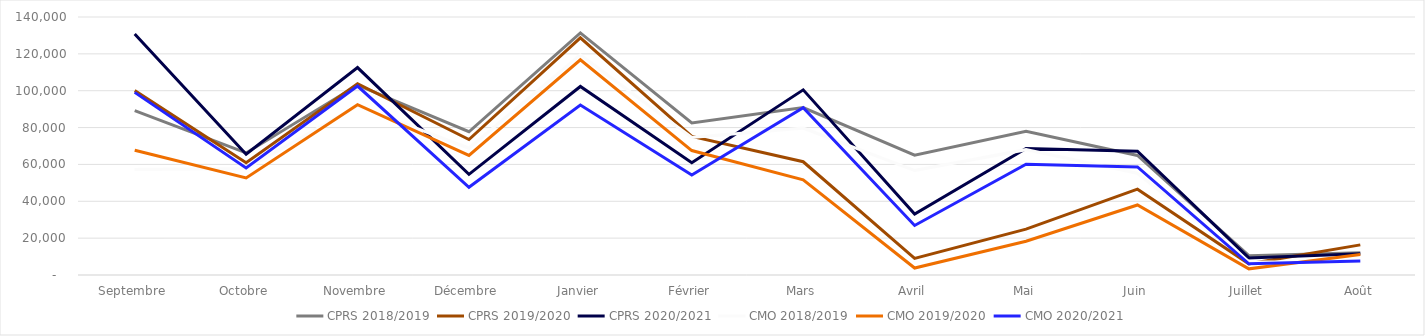
| Category | CPRS | CMO |
|---|---|---|
| Septembre | 130738 | 99102 |
| Octobre | 65524 | 58062 |
| Novembre | 112545 | 102530 |
| Décembre | 54629 | 47621 |
| Janvier | 102302 | 92271 |
| Février | 60954 | 54218 |
| Mars | 100462 | 90794 |
| Avril | 33116 | 26870 |
| Mai | 68636 | 60140 |
| Juin | 67163 | 58669 |
| Juillet | 9262 | 6092 |
| Août | 11551 | 7649 |